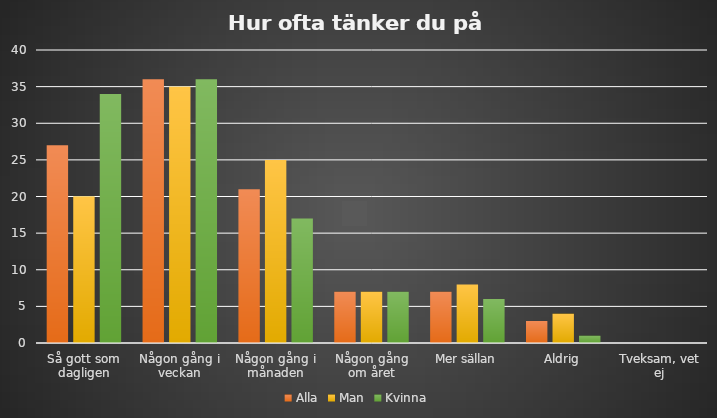
| Category | Alla | Man | Kvinna |
|---|---|---|---|
| Så gott som dagligen | 27 | 20 | 34 |
| Någon gång i veckan | 36 | 35 | 36 |
| Någon gång i månaden | 21 | 25 | 17 |
| Någon gång om året | 7 | 7 | 7 |
| Mer sällan | 7 | 8 | 6 |
| Aldrig | 3 | 4 | 1 |
| Tveksam, vet ej | 0 | 0 | 0 |